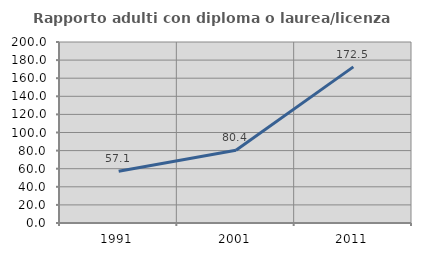
| Category | Rapporto adulti con diploma o laurea/licenza media  |
|---|---|
| 1991.0 | 57.143 |
| 2001.0 | 80.435 |
| 2011.0 | 172.5 |